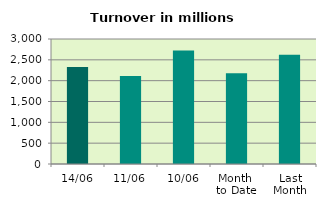
| Category | Series 0 |
|---|---|
| 14/06 | 2328.394 |
| 11/06 | 2109.167 |
| 10/06 | 2722.787 |
| Month 
to Date | 2176.797 |
| Last
Month | 2619.784 |